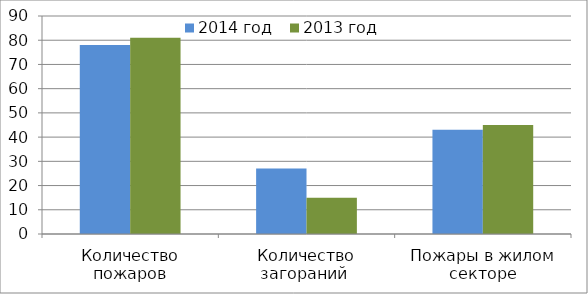
| Category | 2014 год | 2013 год |
|---|---|---|
| Количество пожаров | 78 | 81 |
| Количество загораний  | 27 | 15 |
| Пожары в жилом секторе | 43 | 45 |